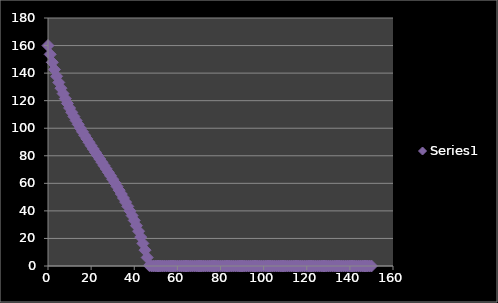
| Category | Series 0 |
|---|---|
| 0.0 | 160 |
| 1.0 | 153.6 |
| 2.0 | 147.814 |
| 3.0 | 142.54 |
| 4.0 | 137.696 |
| 5.0 | 133.215 |
| 6.0 | 129.045 |
| 7.0 | 125.142 |
| 8.0 | 121.468 |
| 9.0 | 117.993 |
| 10.0 | 114.691 |
| 11.0 | 111.539 |
| 12.0 | 108.517 |
| 13.0 | 105.609 |
| 14.0 | 102.799 |
| 15.0 | 100.074 |
| 16.0 | 97.422 |
| 17.0 | 94.833 |
| 18.0 | 92.295 |
| 19.0 | 89.801 |
| 20.0 | 87.341 |
| 21.0 | 84.907 |
| 22.0 | 82.492 |
| 23.0 | 80.088 |
| 24.0 | 77.688 |
| 25.0 | 75.285 |
| 26.0 | 72.871 |
| 27.0 | 70.439 |
| 28.0 | 67.982 |
| 29.0 | 65.492 |
| 30.0 | 62.96 |
| 31.0 | 60.379 |
| 32.0 | 57.738 |
| 33.0 | 55.028 |
| 34.0 | 52.239 |
| 35.0 | 49.357 |
| 36.0 | 46.37 |
| 37.0 | 43.263 |
| 38.0 | 40.02 |
| 39.0 | 36.621 |
| 40.0 | 33.045 |
| 41.0 | 29.267 |
| 42.0 | 25.258 |
| 43.0 | 20.985 |
| 44.0 | 16.408 |
| 45.0 | 11.481 |
| 46.0 | 6.146 |
| 47.0 | 0.337 |
| 48.0 | 0 |
| 49.0 | 0 |
| 50.0 | 0 |
| 51.0 | 0 |
| 52.0 | 0 |
| 53.0 | 0 |
| 54.0 | 0 |
| 55.0 | 0 |
| 56.0 | 0 |
| 57.0 | 0 |
| 58.0 | 0 |
| 59.0 | 0 |
| 60.0 | 0 |
| 61.0 | 0 |
| 62.0 | 0 |
| 63.0 | 0 |
| 64.0 | 0 |
| 65.0 | 0 |
| 66.0 | 0 |
| 67.0 | 0 |
| 68.0 | 0 |
| 69.0 | 0 |
| 70.0 | 0 |
| 71.0 | 0 |
| 72.0 | 0 |
| 73.0 | 0 |
| 74.0 | 0 |
| 75.0 | 0 |
| 76.0 | 0 |
| 77.0 | 0 |
| 78.0 | 0 |
| 79.0 | 0 |
| 80.0 | 0 |
| 81.0 | 0 |
| 82.0 | 0 |
| 83.0 | 0 |
| 84.0 | 0 |
| 85.0 | 0 |
| 86.0 | 0 |
| 87.0 | 0 |
| 88.0 | 0 |
| 89.0 | 0 |
| 90.0 | 0 |
| 91.0 | 0 |
| 92.0 | 0 |
| 93.0 | 0 |
| 94.0 | 0 |
| 95.0 | 0 |
| 96.0 | 0 |
| 97.0 | 0 |
| 98.0 | 0 |
| 99.0 | 0 |
| 100.0 | 0 |
| 101.0 | 0 |
| 102.0 | 0 |
| 103.0 | 0 |
| 104.0 | 0 |
| 105.0 | 0 |
| 106.0 | 0 |
| 107.0 | 0 |
| 108.0 | 0 |
| 109.0 | 0 |
| 110.0 | 0 |
| 111.0 | 0 |
| 112.0 | 0 |
| 113.0 | 0 |
| 114.0 | 0 |
| 115.0 | 0 |
| 116.0 | 0 |
| 117.0 | 0 |
| 118.0 | 0 |
| 119.0 | 0 |
| 120.0 | 0 |
| 121.0 | 0 |
| 122.0 | 0 |
| 123.0 | 0 |
| 124.0 | 0 |
| 125.0 | 0 |
| 126.0 | 0 |
| 127.0 | 0 |
| 128.0 | 0 |
| 129.0 | 0 |
| 130.0 | 0 |
| 131.0 | 0 |
| 132.0 | 0 |
| 133.0 | 0 |
| 134.0 | 0 |
| 135.0 | 0 |
| 136.0 | 0 |
| 137.0 | 0 |
| 138.0 | 0 |
| 139.0 | 0 |
| 140.0 | 0 |
| 141.0 | 0 |
| 142.0 | 0 |
| 143.0 | 0 |
| 144.0 | 0 |
| 145.0 | 0 |
| 146.0 | 0 |
| 147.0 | 0 |
| 148.0 | 0 |
| 149.0 | 0 |
| 150.0 | 0 |